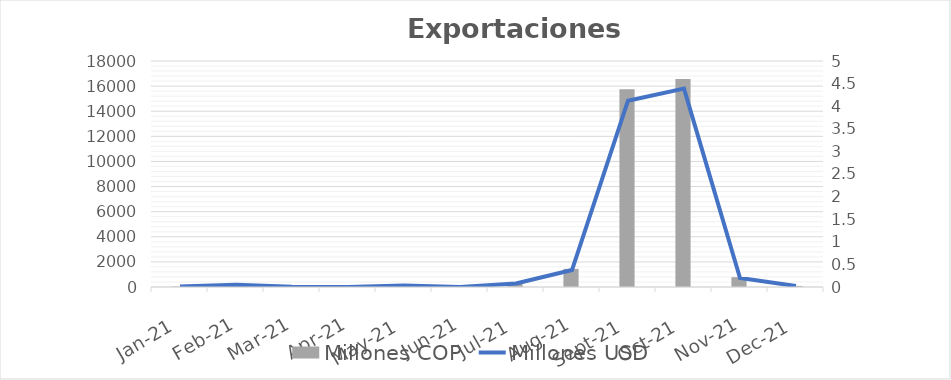
| Category | Millones COP |
|---|---|
| 2021-01-01 | 36.646 |
| 2021-02-01 | 175.393 |
| 2021-03-01 | 14.288 |
| 2021-04-01 | 6.148 |
| 2021-05-01 | 124.501 |
| 2021-06-01 | 8.445 |
| 2021-07-01 | 291.976 |
| 2021-08-01 | 1443.366 |
| 2021-09-01 | 15755.258 |
| 2021-10-01 | 16561.018 |
| 2021-11-01 | 780.264 |
| 2021-12-01 | 85.666 |